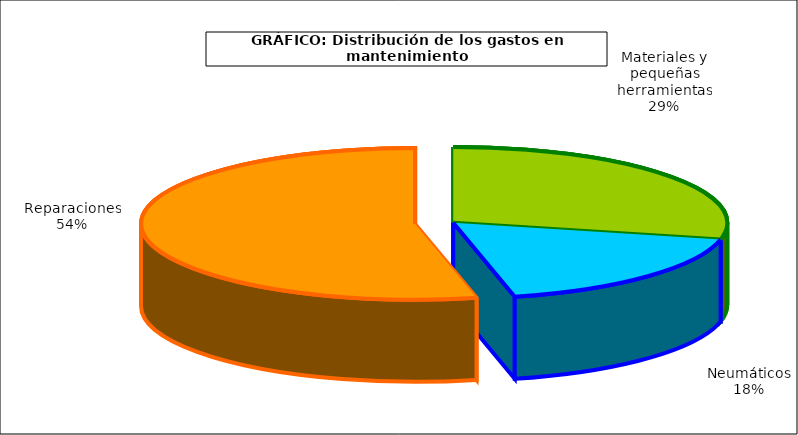
| Category | Series 0 |
|---|---|
| 0 | 507.056 |
| 1 | 317.458 |
| 2 | 952.491 |